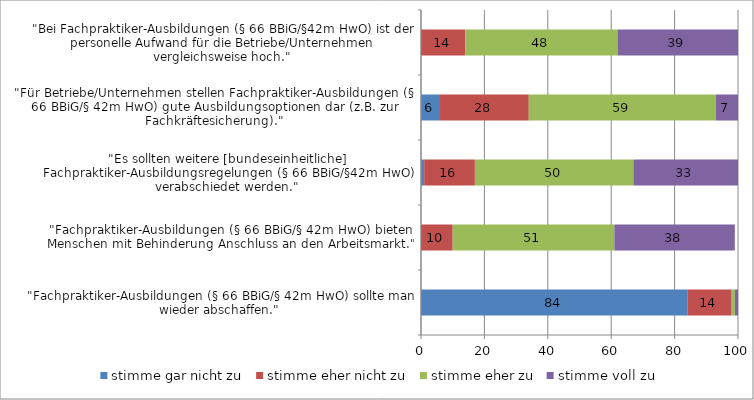
| Category | stimme gar nicht zu | stimme eher nicht zu | stimme eher zu | stimme voll zu |
|---|---|---|---|---|
| "Fachpraktiker-Ausbildungen (§ 66 BBiG/§ 42m HwO) sollte man wieder abschaffen." | 84 | 14 | 1 | 1 |
| "Fachpraktiker-Ausbildungen (§ 66 BBiG/§ 42m HwO) bieten Menschen mit Behinderung Anschluss an den Arbeitsmarkt." | 0 | 10 | 51 | 38 |
| "Es sollten weitere [bundeseinheitliche] Fachpraktiker-Ausbildungsregelungen (§ 66 BBiG/§42m HwO) verabschiedet werden." | 1 | 16 | 50 | 33 |
| "Für Betriebe/Unternehmen stellen Fachpraktiker-Ausbildungen (§ 66 BBiG/§ 42m HwO) gute Ausbildungsoptionen dar (z.B. zur Fachkräftesicherung)." | 6 | 28 | 59 | 7 |
| "Bei Fachpraktiker-Ausbildungen (§ 66 BBiG/§42m HwO) ist der personelle Aufwand für die Betriebe/Unternehmen vergleichsweise hoch." | 0 | 14 | 48 | 39 |